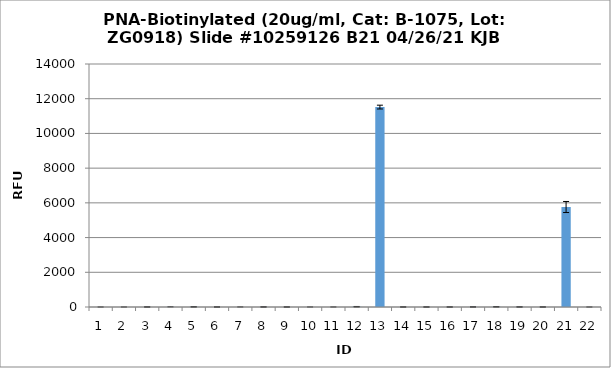
| Category | Series 0 |
|---|---|
| 0 | 0.25 |
| 1 | 0.25 |
| 2 | 2 |
| 3 | 4.5 |
| 4 | 7.75 |
| 5 | 1.5 |
| 6 | 1 |
| 7 | 3.25 |
| 8 | 0.75 |
| 9 | 0.5 |
| 10 | 0.75 |
| 11 | 15.5 |
| 12 | 11518.5 |
| 13 | 1 |
| 14 | 0.75 |
| 15 | 0.75 |
| 16 | 3.5 |
| 17 | 10 |
| 18 | 3.25 |
| 19 | 1 |
| 20 | 5760.5 |
| 21 | 0.25 |